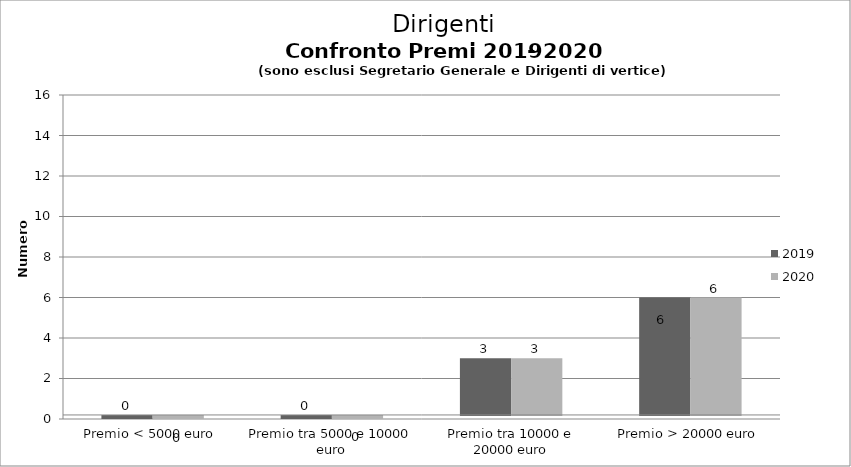
| Category | 2019 | 2020 |
|---|---|---|
| Premio < 5000 euro | 0 | 0 |
| Premio tra 5000 e 10000 euro | 0 | 0 |
| Premio tra 10000 e 20000 euro | 3 | 3 |
| Premio > 20000 euro | 6 | 6 |